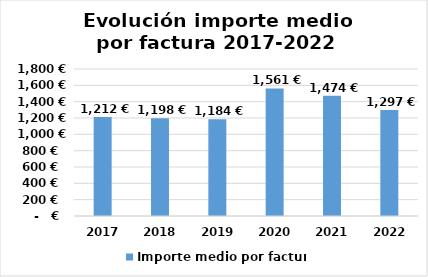
| Category | Importe medio por factura |
|---|---|
| 2017.0 | 1212 |
| 2018.0 | 1197.511 |
| 2019.0 | 1184.026 |
| 2020.0 | 1561.298 |
| 2021.0 | 1473.69 |
| 2022.0 | 1297.353 |